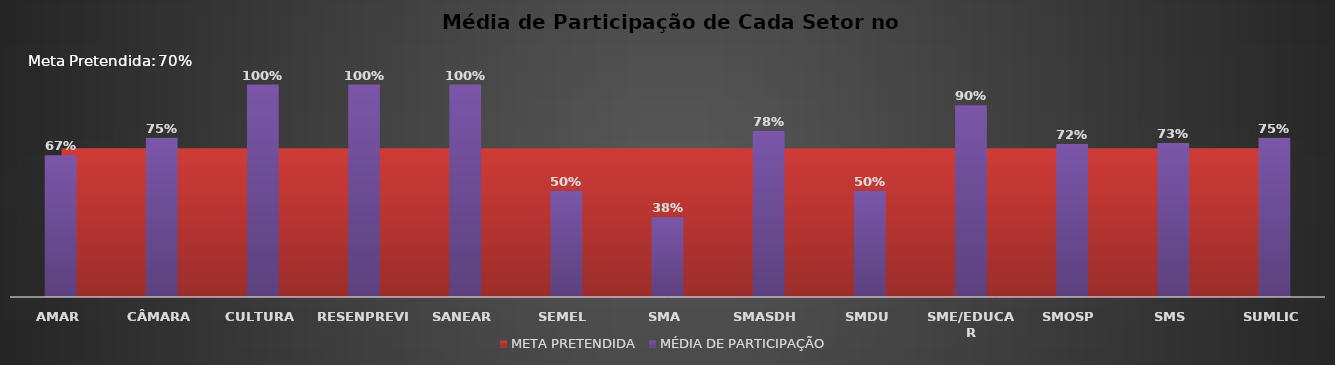
| Category | MÉDIA DE PARTICIPAÇÃO |
|---|---|
| AMAR | 0.667 |
| CÂMARA | 0.75 |
| CULTURA | 1 |
| RESENPREVI | 1 |
| SANEAR | 1 |
| SEMEL | 0.5 |
| SMA | 0.375 |
| SMASDH | 0.783 |
| SMDU | 0.5 |
| SME/EDUCAR | 0.902 |
| SMOSP | 0.721 |
| SMS | 0.725 |
| SUMLIC | 0.75 |